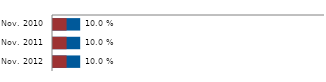
| Category | Global acute malnutrition | Severe acute malnutrition |
|---|---|---|
| Nov. 2010 | 0.1 | 0.05 |
| Nov. 2011 | 0.1 | 0.05 |
| Nov. 2012 | 0.1 | 0.05 |